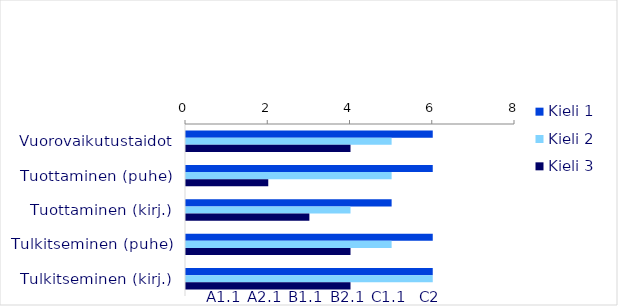
| Category | Kieli 1 | Kieli 2 | Kieli 3 |
|---|---|---|---|
| Vuorovaikutustaidot | 6 | 5 | 4 |
| Tuottaminen (puhe) | 6 | 5 | 2 |
| Tuottaminen (kirj.) | 5 | 4 | 3 |
| Tulkitseminen (puhe) | 6 | 5 | 4 |
| Tulkitseminen (kirj.) | 6 | 6 | 4 |